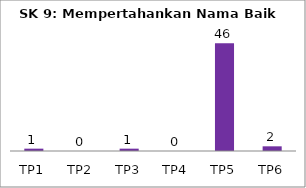
| Category | Bil Pel |
|---|---|
| TP1 | 1 |
| TP2 | 0 |
| TP3 | 1 |
| TP4 | 0 |
| TP5 | 46 |
| TP6 | 2 |